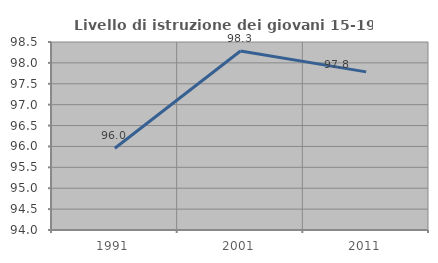
| Category | Livello di istruzione dei giovani 15-19 anni |
|---|---|
| 1991.0 | 95.957 |
| 2001.0 | 98.283 |
| 2011.0 | 97.785 |